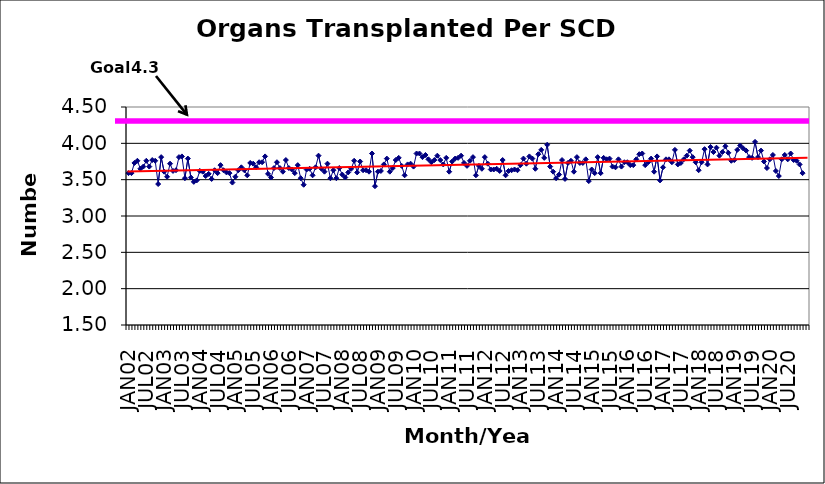
| Category | Series 0 |
|---|---|
| JAN02 | 3.59 |
| FEB02 | 3.59 |
| MAR02 | 3.73 |
| APR02 | 3.76 |
| MAY02 | 3.65 |
| JUN02 | 3.68 |
| JUL02 | 3.76 |
| AUG02 | 3.68 |
| SEP02 | 3.77 |
| OCT02 | 3.76 |
| NOV02 | 3.44 |
| DEC02 | 3.81 |
| JAN03 | 3.61 |
| FEB03 | 3.54 |
| MAR03 | 3.72 |
| APR03 | 3.62 |
| MAY03 | 3.63 |
| JUN03 | 3.81 |
| JUL03 | 3.82 |
| AUG03 | 3.52 |
| SEP03 | 3.79 |
| OCT03 | 3.53 |
| NOV03 | 3.47 |
| DEC03 | 3.49 |
| JAN04 | 3.62 |
| FEB04 | 3.61 |
| MAR04 | 3.55 |
| APR04 | 3.58 |
| MAY04 | 3.51 |
| JUN04 | 3.63 |
| JUL04 | 3.59 |
| AUG04 | 3.7 |
| SEP04 | 3.63 |
| OCT04 | 3.6 |
| NOV04 | 3.59 |
| DEC04 | 3.46 |
| JAN05 | 3.54 |
| FEB05 | 3.63 |
| MAR05 | 3.67 |
| APR05 | 3.63 |
| MAY05 | 3.56 |
| JUN05 | 3.73 |
| JUL05 | 3.72 |
| AUG05 | 3.67 |
| SEP05 | 3.74 |
| OCT05 | 3.74 |
| NOV05 | 3.82 |
| DEC05 | 3.58 |
| JAN06 | 3.53 |
| FEB06 | 3.66 |
| MAR06 | 3.74 |
| APR06 | 3.66 |
| MAY06 | 3.61 |
| JUN06 | 3.77 |
| JUL06 | 3.66 |
| AUG06 | 3.64 |
| SEP06 | 3.59 |
| OCT06 | 3.7 |
| NOV06 | 3.52 |
| DEC06 | 3.43 |
| JAN07 | 3.64 |
| FEB07 | 3.65 |
| MAR07 | 3.56 |
| APR07 | 3.67 |
| MAY07 | 3.83 |
| JUN07 | 3.65 |
| JUL07 | 3.61 |
| AUG07 | 3.72 |
| SEP07 | 3.52 |
| OCT07 | 3.63 |
| NOV07 | 3.52 |
| DEC07 | 3.66 |
| JAN08 | 3.57 |
| FEB08 | 3.53 |
| MAR08 | 3.6 |
| APR08 | 3.65 |
| MAY08 | 3.76 |
| JUN08 | 3.6 |
| JUL08 | 3.75 |
| AUG08 | 3.63 |
| SEP08 | 3.63 |
| OCT08 | 3.61 |
| NOV08 | 3.86 |
| DEC08 | 3.41 |
| JAN09 | 3.61 |
| FEB09 | 3.62 |
| MAR09 | 3.71 |
| APR09 | 3.79 |
| MAY09 | 3.61 |
| JUN09 | 3.66 |
| JUL09 | 3.77 |
| AUG09 | 3.8 |
| SEP09 | 3.69 |
| OCT09 | 3.56 |
| NOV09 | 3.71 |
| DEC09 | 3.72 |
| JAN10 | 3.68 |
| FEB10 | 3.86 |
| MAR10 | 3.86 |
| APR10 | 3.81 |
| MAY10 | 3.84 |
| JUN10 | 3.78 |
| JUL10 | 3.74 |
| AUG10 | 3.77 |
| SEP10 | 3.83 |
| OCT10 | 3.77 |
| NOV10 | 3.71 |
| DEC10 | 3.8 |
| JAN11 | 3.61 |
| FEB11 | 3.75 |
| MAR11 | 3.79 |
| APR11 | 3.8 |
| MAY11 | 3.83 |
| JUN11 | 3.73 |
| JUL11 | 3.69 |
| AUG11 | 3.76 |
| SEP11 | 3.81 |
| OCT11 | 3.56 |
| NOV11 | 3.69 |
| DEC11 | 3.65 |
| JAN12 | 3.81 |
| FEB12 | 3.72 |
| MAR12 | 3.64 |
| APR12 | 3.64 |
| MAY12 | 3.65 |
| JUN12 | 3.62 |
| JUL12 | 3.77 |
| AUG12 | 3.56 |
| SEP12 | 3.62 |
| OCT12 | 3.63 |
| NOV12 | 3.64 |
| DEC12 | 3.63 |
| JAN13 | 3.7 |
| FEB13 | 3.79 |
| MAR13 | 3.72 |
| APR13 | 3.82 |
| MAY13 | 3.79 |
| JUN13 | 3.65 |
| JUL13 | 3.85 |
| AUG13 | 3.91 |
| SEP13 | 3.8 |
| OCT13 | 3.98 |
| NOV13 | 3.68 |
| DEC13 | 3.61 |
| JAN14 | 3.52 |
| FEB14 | 3.57 |
| MAR14 | 3.77 |
| APR14 | 3.51 |
| MAY14 | 3.73 |
| JUN14 | 3.76 |
| JUL14 | 3.61 |
| AUG14 | 3.81 |
| SEP14 | 3.73 |
| OCT14 | 3.73 |
| NOV14 | 3.78 |
| DEC14 | 3.48 |
| JAN15 | 3.64 |
| FEB15 | 3.59 |
| MAR15 | 3.81 |
| APR15 | 3.59 |
| MAY15 | 3.8 |
| JUN15 | 3.78 |
| JUL15 | 3.79 |
| AUG15 | 3.68 |
| SEP15 | 3.67 |
| OCT15 | 3.78 |
| NOV15 | 3.68 |
| DEC15 | 3.74 |
| JAN16 | 3.74 |
| FEB16 | 3.7 |
| MAR16 | 3.7 |
| APR16 | 3.78 |
| MAY16 | 3.85 |
| JUN16 | 3.86 |
| JUL16 | 3.7 |
| AUG16 | 3.74 |
| SEP16 | 3.79 |
| OCT16 | 3.61 |
| NOV16 | 3.82 |
| DEC16 | 3.49 |
| JAN17 | 3.67 |
| FEB17 | 3.78 |
| MAR17 | 3.78 |
| APR17 | 3.74 |
| MAY17 | 3.91 |
| JUN17 | 3.71 |
| JUL17 | 3.73 |
| AUG17 | 3.78 |
| SEP17 | 3.83 |
| OCT17 | 3.9 |
| NOV17 | 3.81 |
| DEC17 | 3.74 |
| JAN18 | 3.63 |
| FEB18 | 3.74 |
| MAR18 | 3.92 |
| APR18 | 3.71 |
| MAY18 | 3.95 |
| JUN18 | 3.88 |
| JUL18 | 3.94 |
| AUG18 | 3.83 |
| SEP18 | 3.88 |
| OCT18 | 3.96 |
| NOV18 | 3.87 |
| DEC18 | 3.76 |
| JAN19 | 3.77 |
| FEB19 | 3.91 |
| MAR19 | 3.97 |
| APR19 | 3.93 |
| MAY19 | 3.9 |
| JUN19 | 3.81 |
| JUL19 | 3.8 |
| AUG19 | 4.02 |
| SEP19 | 3.81 |
| OCT19 | 3.9 |
| NOV19 | 3.75 |
| DEC19 | 3.66 |
| JAN20 | 3.78 |
| FEB20 | 3.84 |
| MAR20 | 3.62 |
| APR20 | 3.55 |
| MAY20 | 3.78 |
| JUN20 | 3.84 |
| JUL20 | 3.78 |
| AUG20 | 3.86 |
| SEP20 | 3.77 |
| OCT20 | 3.76 |
| NOV20 | 3.71 |
| DEC20 | 3.59 |